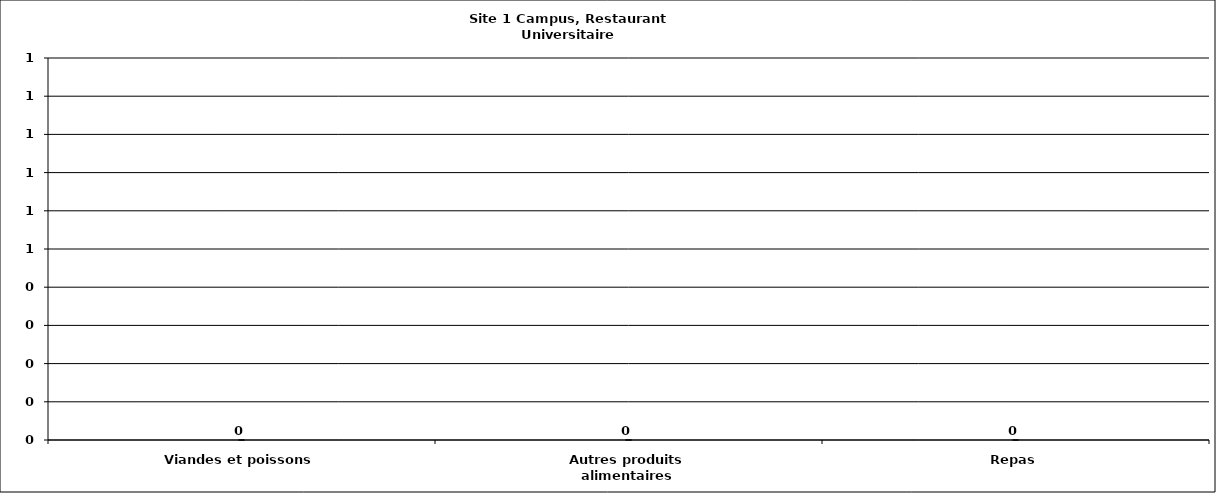
| Category | Series 0 |
|---|---|
| Viandes et poissons | 0 |
| Autres produits alimentaires | 0 |
| Repas | 0 |